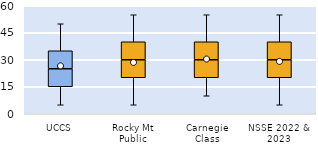
| Category | 25th | 50th | 75th |
|---|---|---|---|
| UCCS | 15 | 10 | 10 |
| Rocky Mt Public | 20 | 10 | 10 |
| Carnegie Class | 20 | 10 | 10 |
| NSSE 2022 & 2023 | 20 | 10 | 10 |